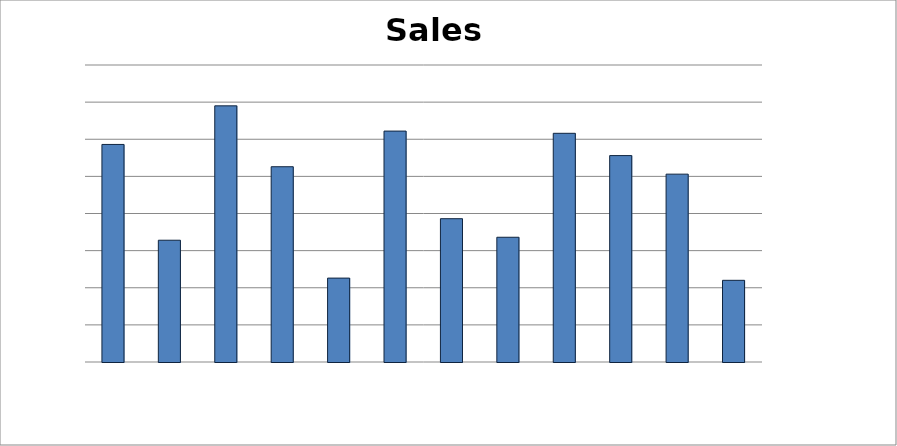
| Category | Actual |
|---|---|
| 0 | 2930 |
| 1 | 1640 |
| 2 | 3450 |
| 3 | 2630 |
| 4 | 1130 |
| 5 | 3110 |
| 6 | 1930 |
| 7 | 1680 |
| 8 | 3080 |
| 9 | 2780 |
| 10 | 2530 |
| 11 | 1100 |